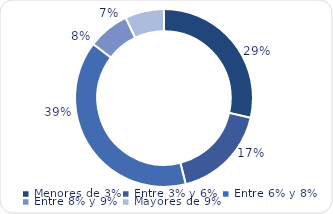
| Category | Series 0 |
|---|---|
| Menores de 3% | 4169.6 |
| Entre 3% y 6% | 2551.1 |
| Entre 6% y 8% | 5732.3 |
| Entre 8% y 9% | 1101.1 |
| Mayores de 9% | 1034 |